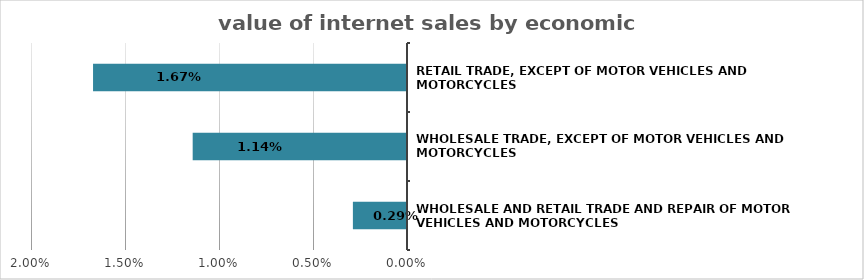
| Category | Series 0 |
|---|---|
| Wholesale and retail trade and repair of motor vehicles and motorcycles | 0.003 |
| Wholesale trade, except of motor vehicles and motorcycles | 0.011 |
| Retail trade, except of motor vehicles and motorcycles | 0.017 |